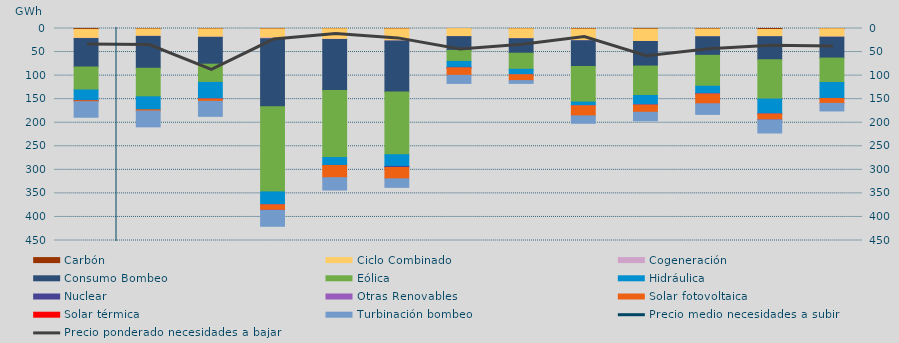
| Category | Carbón | Ciclo Combinado | Cogeneración | Consumo Bombeo | Eólica | Hidráulica | Nuclear | Otras Renovables | Solar fotovoltaica | Solar térmica | Turbinación bombeo |
|---|---|---|---|---|---|---|---|---|---|---|---|
| 0 | 1954 | 18792.9 | 569.425 | 60395.65 | 48803.7 | 22168.6 | 540.725 | 0 | 2191.975 | 0 | 32969.35 |
| 1 | 1013 | 15498.975 | 284.05 | 67580.25 | 60658.55 | 27501.4 | 0 | 0 | 2682.825 | 0 | 33526.625 |
| 2 | 883 | 17650.875 | 181.5 | 57086.475 | 38624.325 | 35109.7 | 186 | 16 | 4912.925 | 0 | 31800.3 |
| 3 | 906 | 19278.9 | 1400.95 | 144482.175 | 180813.55 | 26734.575 | 692.75 | 22 | 11477.9 | 11 | 34001.625 |
| 4 | 552 | 22218.15 | 797.8 | 108258.5 | 142089.65 | 16666.15 | 246.5 | 0 | 25852.05 | 0 | 26149.6 |
| 5 | 807.25 | 25335.65 | 347.3 | 108093.3 | 133344.025 | 24879.7 | 2223.5 | 0 | 24040.15 | 0 | 18092.95 |
| 6 | 106 | 17047.925 | 126.5 | 29117.95 | 23568.5 | 12502.85 | 1151.275 | 77.25 | 15574.875 | 0 | 17276.575 |
| 7 | 579.2 | 20963.4 | 137.5 | 30788.55 | 34164.875 | 11525.425 | 0 | 54.75 | 12384.3 | 0 | 5908.5 |
| 8 | 1158 | 24501.45 | 317.675 | 54673.8 | 75655.3 | 7633.3 | 0 | 222.25 | 21301.725 | 0 | 15716.4 |
| 9 | 1320 | 26201.875 | 114.975 | 52169.95 | 62410.575 | 19581.95 | 749.725 | 79.5 | 15213.95 | 0 | 17984.525 |
| 10 | 1091.6 | 16369.1 | 103.875 | 39371.7 | 65624.175 | 15878.2 | 732.15 | 7.75 | 20634.675 | 0 | 22496.1 |
| 11 | 2086.9 | 15113 | 225.75 | 49033.5 | 83287.225 | 31392.5 | 350.375 | 84.5 | 12135.55 | 4 | 28067.275 |
| 12 | 494 | 17543.65 | 436.35 | 44328 | 51868 | 33738.425 | 24 | 178.25 | 10381.85 | 0 | 16037.9 |